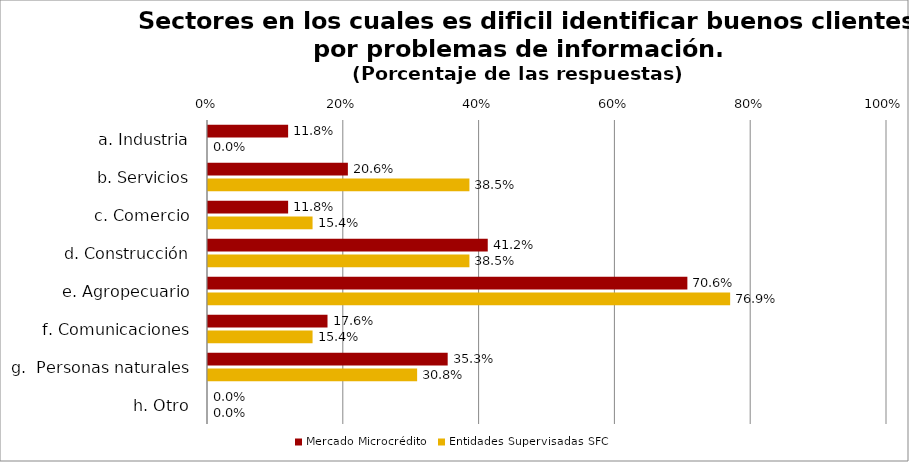
| Category | Mercado Microcrédito | Entidades Supervisadas SFC |
|---|---|---|
| a. Industria | 0.118 | 0 |
| b. Servicios | 0.206 | 0.385 |
| c. Comercio | 0.118 | 0.154 |
| d. Construcción | 0.412 | 0.385 |
| e. Agropecuario | 0.706 | 0.769 |
| f. Comunicaciones | 0.176 | 0.154 |
| g.  Personas naturales | 0.353 | 0.308 |
| h. Otro | 0 | 0 |